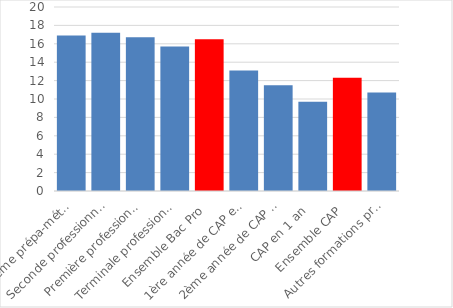
| Category | 2022 |
|---|---|
| Troisième prépa-métiers | 16.9 |
| Seconde professionnelle | 17.2 |
| Première professionnelle | 16.7 |
| Terminale professionnelle | 15.7 |
| Ensemble Bac Pro | 16.5 |
| 1ère année de CAP en 2 ans | 13.1 |
| 2ème année de CAP en 2 ans | 11.5 |
| CAP en 1 an | 9.7 |
| Ensemble CAP | 12.3 |
| Autres formations professionnelles | 10.7 |